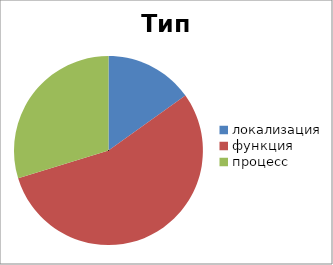
| Category | Тип словаря |
|---|---|
| локализация | 756 |
| функция | 2757 |
| процесс | 1486 |